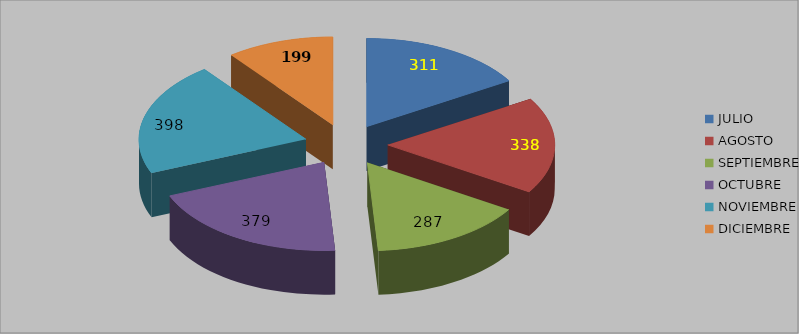
| Category | Series 0 |
|---|---|
| JULIO | 311 |
| AGOSTO | 338 |
| SEPTIEMBRE | 287 |
| OCTUBRE | 379 |
| NOVIEMBRE | 398 |
| DICIEMBRE | 199 |